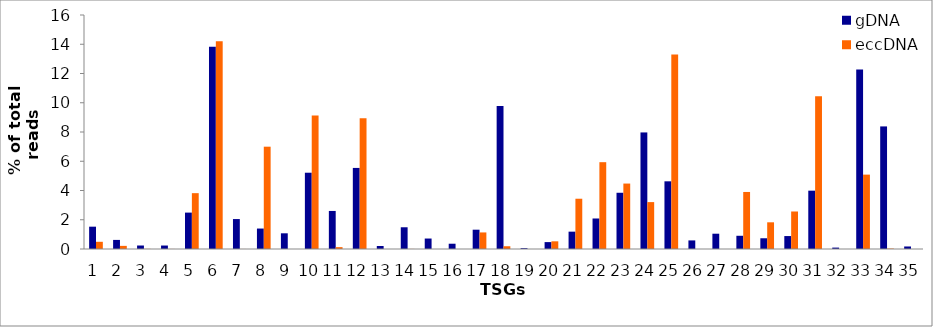
| Category | gDNA | eccDNA |
|---|---|---|
| 0 | 1.526 | 0.493 |
| 1 | 0.622 | 0.214 |
| 2 | 0.239 | 0.009 |
| 3 | 0.237 | 0.004 |
| 4 | 2.489 | 3.818 |
| 5 | 13.83 | 14.205 |
| 6 | 2.047 | 0.003 |
| 7 | 1.399 | 6.996 |
| 8 | 1.073 | 0.002 |
| 9 | 5.216 | 9.126 |
| 10 | 2.601 | 0.128 |
| 11 | 5.543 | 8.943 |
| 12 | 0.204 | 0 |
| 13 | 1.486 | 0.006 |
| 14 | 0.716 | 0 |
| 15 | 0.361 | 0.001 |
| 16 | 1.32 | 1.133 |
| 17 | 9.779 | 0.188 |
| 18 | 0.057 | 0 |
| 19 | 0.472 | 0.526 |
| 20 | 1.186 | 3.437 |
| 21 | 2.086 | 5.936 |
| 22 | 3.845 | 4.475 |
| 23 | 7.97 | 3.207 |
| 24 | 4.628 | 13.307 |
| 25 | 0.587 | 0 |
| 26 | 1.046 | 0 |
| 27 | 0.904 | 3.9 |
| 28 | 0.734 | 1.825 |
| 29 | 0.885 | 2.565 |
| 30 | 3.989 | 10.438 |
| 31 | 0.096 | 0.002 |
| 32 | 12.273 | 5.086 |
| 33 | 8.382 | 0.029 |
| 34 | 0.172 | 0 |